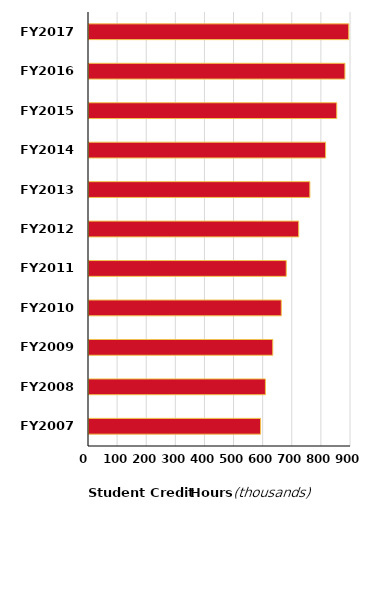
| Category | Total SCH |
|---|---|
| FY2007 | 592796 |
| FY2008 | 609412 |
| FY2009 | 634669 |
| FY2010 | 663954 |
| FY2011 | 681034 |
| FY2012 | 723841 |
| FY2013 | 762148 |
| FY2014 | 816235 |
| FY2015 | 854434.71 |
| FY2016 | 882547.83 |
| FY2017 | 895711.528 |